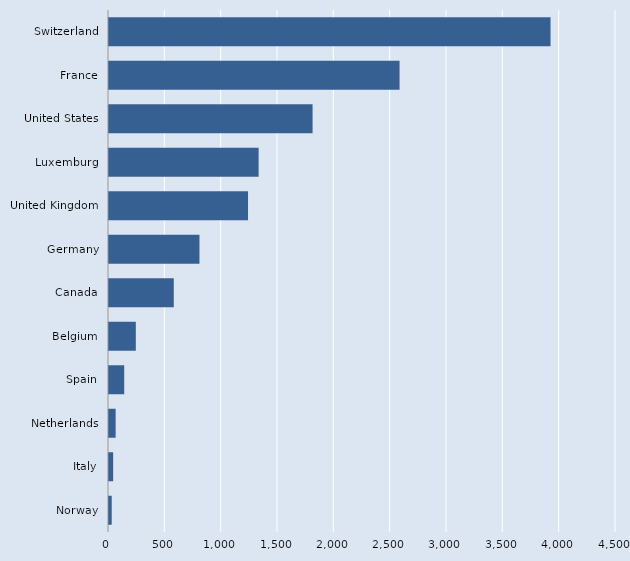
| Category | Series 0 |
|---|---|
| Norway | 24 |
| Italy | 37 |
| Netherlands | 59 |
| Spain | 135 |
| Belgium | 238 |
| Canada | 575 |
| Germany | 803 |
| United Kingdom | 1234 |
| Luxemburg | 1328 |
| United States | 1807 |
| France | 2579 |
| Switzerland | 3919 |